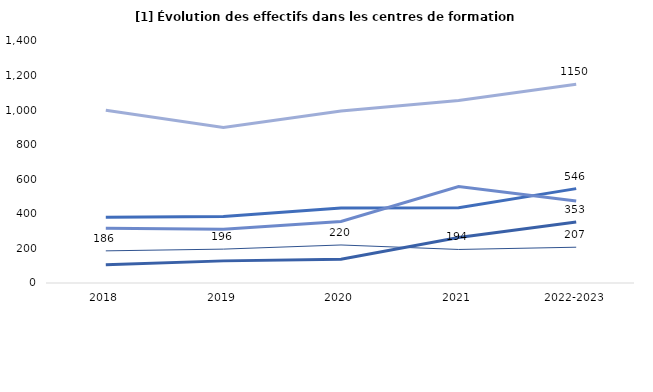
| Category | Niveaux 7 et 8 Niveau 6 Niveau 5 Niveau 4 Niveau 3 | Niveau 6 | Niveau 5 | Niveau 4 | Niveau 3 | Niveau 0 |
|---|---|---|---|---|---|---|
| 2018 | 186 | 105 | 381 | 317 | 999 |  |
| 2019 | 196 | 128 | 385 | 311 | 900 |  |
| 2020 | 220 | 137 | 434 | 356 | 995 |  |
| 2021 | 194 | 263 | 435 | 558 | 1056 |  |
| 2022-2023 | 207 | 353 | 546 | 475 | 1150 |  |